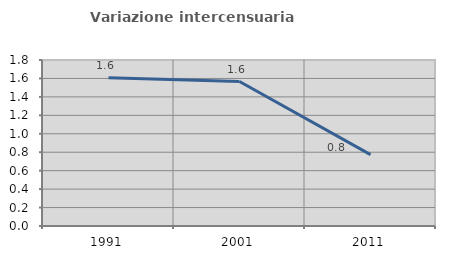
| Category | Variazione intercensuaria annua |
|---|---|
| 1991.0 | 1.606 |
| 2001.0 | 1.566 |
| 2011.0 | 0.774 |